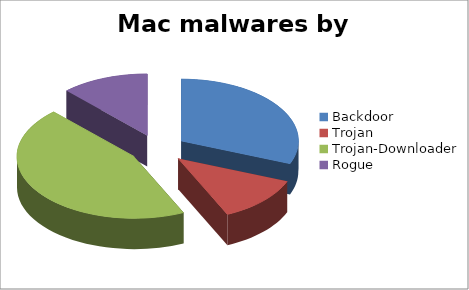
| Category | Mac malwares by type |
|---|---|
| Backdoor | 18 |
| Trojan | 7 |
| Trojan-Downloader | 26 |
| Rogue | 7 |